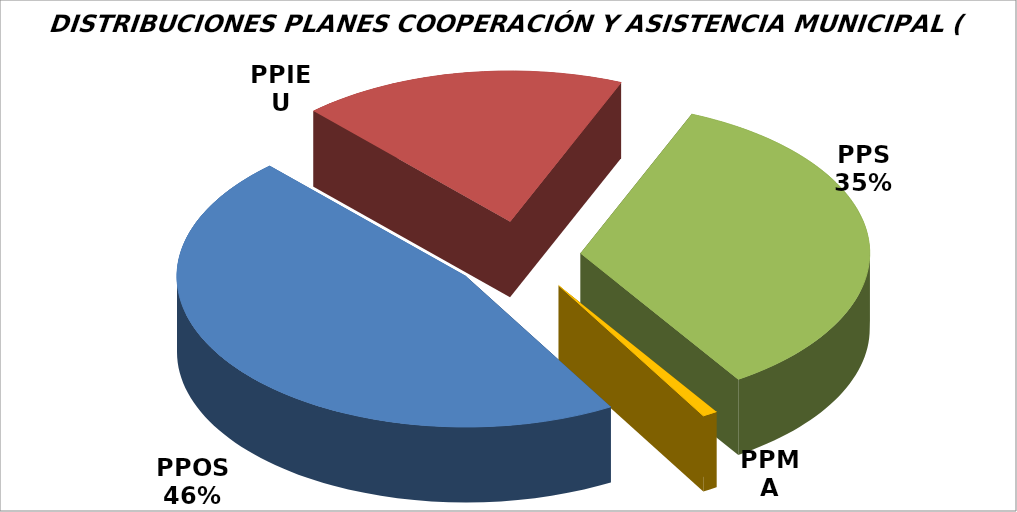
| Category | Series 0 |
|---|---|
| PPOS | 15000000 |
| PPIEU | 5868068 |
| PPS | 11158234 |
| PPMA | 274080 |